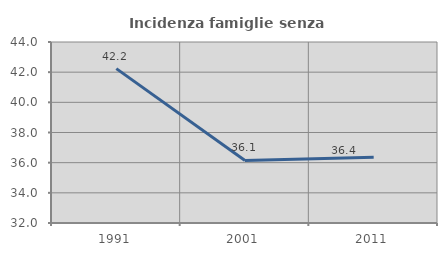
| Category | Incidenza famiglie senza nuclei |
|---|---|
| 1991.0 | 42.236 |
| 2001.0 | 36.145 |
| 2011.0 | 36.364 |